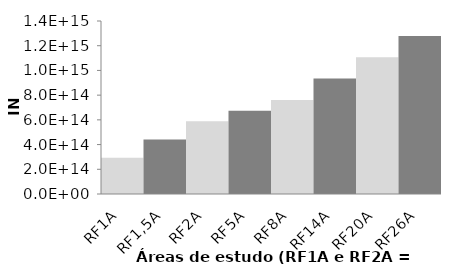
| Category | Series 0 |
|---|---|
| RF1A | 294046560000000 |
| RF1,5A | 441069840000000 |
| RF2A | 588093120000000 |
| RF5A | 674493120000000 |
| RF8A | 760893120000000 |
| RF14A | 933693120000000 |
| RF20A | 1106493120000000 |
| RF26A | 1279293120000000 |